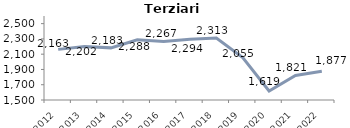
| Category | Terziario |
|---|---|
| 2012.0 | 2162.9 |
| 2013.0 | 2201.5 |
| 2014.0 | 2182.7 |
| 2015.0 | 2287.5 |
| 2016.0 | 2266.8 |
| 2017.0 | 2294 |
| 2018.0 | 2312.5 |
| 2019.0 | 2054.7 |
| 2020.0 | 1618.7 |
| 2021.0 | 1820.5 |
| 2022.0 | 1876.9 |